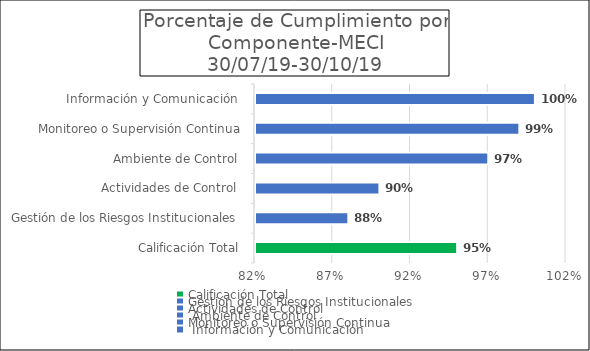
| Category | Series 0 |
|---|---|
| Calificación Total | 0.95 |
| Gestión de los Riesgos Institucionales  | 0.88 |
| Actividades de Control  | 0.9 |
|  Ambiente de Control  | 0.97 |
| Monitoreo o Supervisión Continua | 0.99 |
|  Información y Comunicación  | 1 |